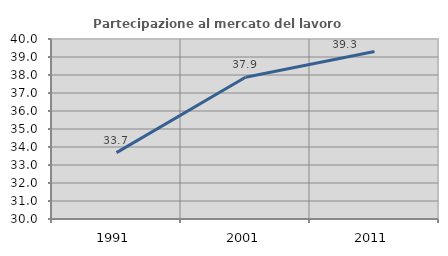
| Category | Partecipazione al mercato del lavoro  femminile |
|---|---|
| 1991.0 | 33.688 |
| 2001.0 | 37.879 |
| 2011.0 | 39.305 |